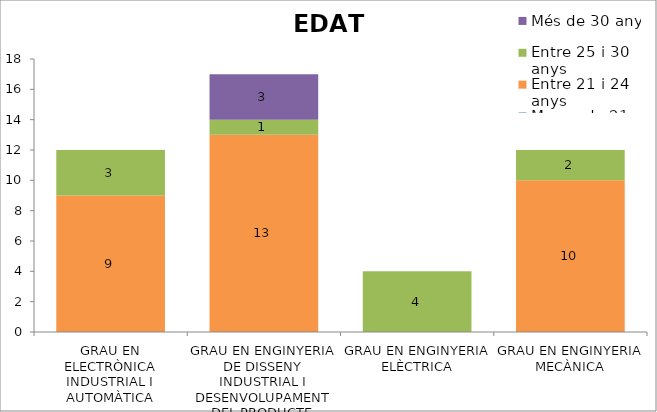
| Category | Menys de 21 anys | Entre 21 i 24 anys | Entre 25 i 30 anys | Més de 30 anys |
|---|---|---|---|---|
| GRAU EN ELECTRÒNICA INDUSTRIAL I AUTOMÀTICA | 0 | 9 | 3 | 0 |
| GRAU EN ENGINYERIA DE DISSENY INDUSTRIAL I DESENVOLUPAMENT DEL PRODUCTE | 0 | 13 | 1 | 3 |
| GRAU EN ENGINYERIA ELÈCTRICA | 0 | 0 | 4 | 0 |
| GRAU EN ENGINYERIA MECÀNICA | 0 | 10 | 2 | 0 |